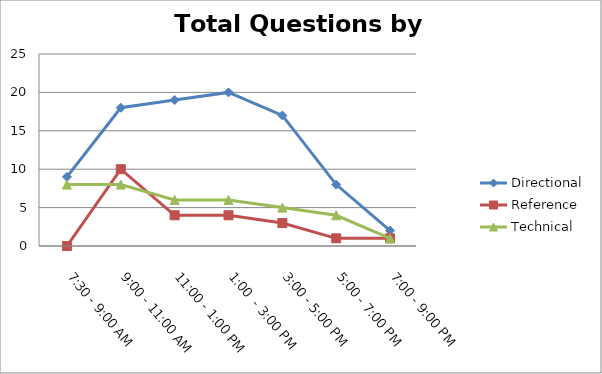
| Category | Directional | Reference | Technical |
|---|---|---|---|
| 7:30 - 9:00 AM | 9 | 0 | 8 |
| 9:00 - 11:00 AM | 18 | 10 | 8 |
| 11:00 - 1:00 PM | 19 | 4 | 6 |
| 1:00  - 3:00 PM | 20 | 4 | 6 |
| 3:00 - 5:00 PM | 17 | 3 | 5 |
| 5:00 - 7:00 PM | 8 | 1 | 4 |
| 7:00 - 9:00 PM | 2 | 1 | 1 |